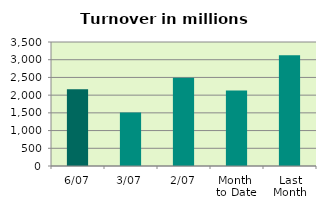
| Category | Series 0 |
|---|---|
| 6/07 | 2162.911 |
| 3/07 | 1512.395 |
| 2/07 | 2492.449 |
| Month 
to Date | 2129.007 |
| Last
Month | 3125.17 |